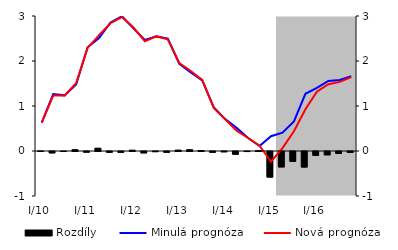
| Category | Rozdíly |
|---|---|
| 0 | 0.001 |
| 1 | -0.03 |
| 2 | 0 |
| 3 | 0.03 |
| 4 | -0.014 |
| 5 | 0.063 |
| 6 | -0.017 |
| 7 | -0.017 |
| 8 | 0.019 |
| 9 | -0.03 |
| 10 | -0.003 |
| 11 | -0.017 |
| 12 | 0.02 |
| 13 | 0.03 |
| 14 | 0.011 |
| 15 | -0.017 |
| 16 | -0.006 |
| 17 | -0.061 |
| 18 | -0.001 |
| 19 | 0.007 |
| 20 | -0.568 |
| 21 | -0.342 |
| 22 | -0.218 |
| 23 | -0.344 |
| 24 | -0.084 |
| 25 | -0.073 |
| 26 | -0.044 |
| 27 | -0.02 |